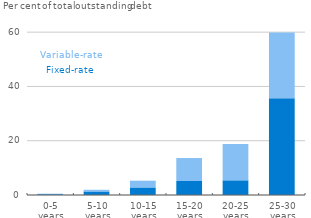
| Category | Remaining debt of fixed-rate loans | Remaining debt of variable-rate loans |
|---|---|---|
| 0-5
years | 0.291 | 0.185 |
| 5-10
years | 1.303 | 0.619 |
| 10-15 years | 2.794 | 2.477 |
| 15-20 years | 5.15 | 8.466 |
| 20-25 years | 5.415 | 13.394 |
| 25-30 years | 35.677 | 24.23 |